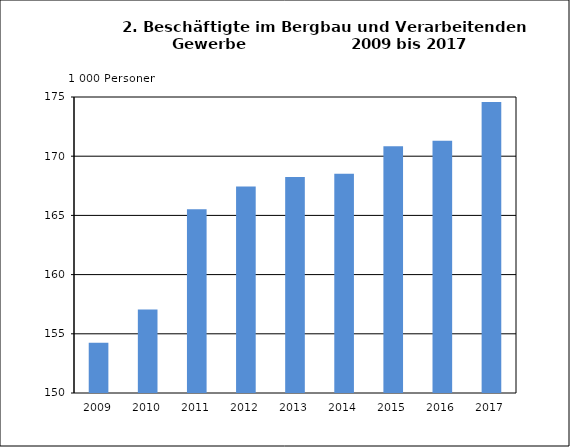
| Category | Beschäftigte |
|---|---|
| 2009.0 | 154.243 |
| 2010.0 | 157.043 |
| 2011.0 | 165.528 |
| 2012.0 | 167.446 |
| 2013.0 | 168.246 |
| 2014.0 | 168.527 |
| 2015.0 | 170.836 |
| 2016.0 | 171.305 |
| 2017.0 | 174.572 |